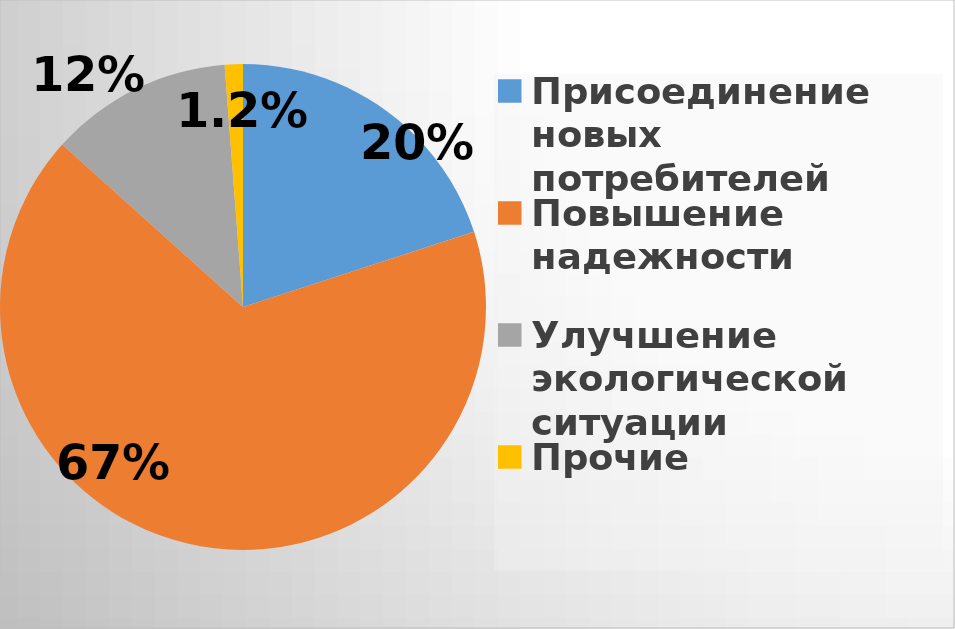
| Category | Series 0 |
|---|---|
| Присоединение новых потребителей | 1917.334 |
| Повышение надежности | 6390.949 |
| Улучшение экологической ситуации | 1164.653 |
| Прочие | 115.685 |